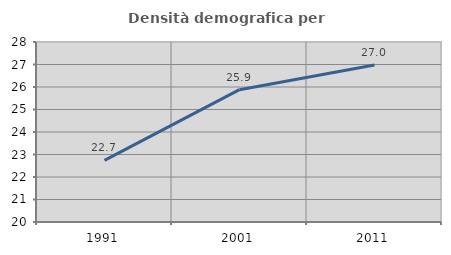
| Category | Densità demografica |
|---|---|
| 1991.0 | 22.741 |
| 2001.0 | 25.88 |
| 2011.0 | 26.975 |